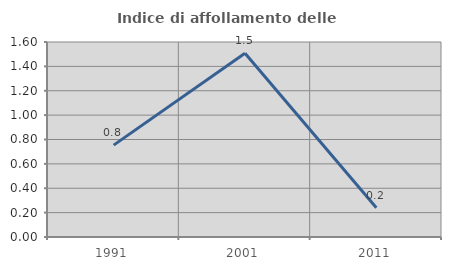
| Category | Indice di affollamento delle abitazioni  |
|---|---|
| 1991.0 | 0.754 |
| 2001.0 | 1.508 |
| 2011.0 | 0.239 |